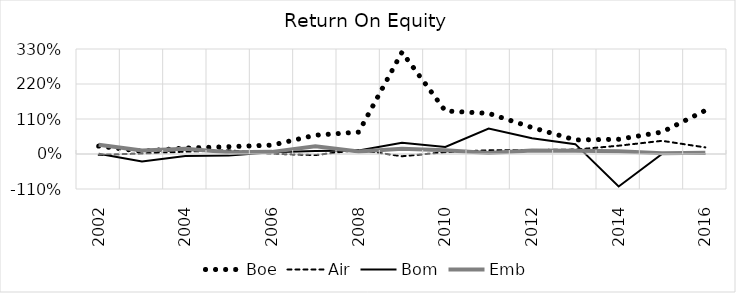
| Category | Boe | Air | Bom | Emb |
|---|---|---|---|---|
| 2002.0 | 0.248 | -0.026 | 0.01 | 0.294 |
| 2003.0 | 0.087 | 0.014 | -0.232 | 0.111 |
| 2004.0 | 0.187 | 0.074 | -0.066 | 0.165 |
| 2005.0 | 0.229 | 0.115 | -0.051 | 0.058 |
| 2006.0 | 0.279 | 0.008 | 0.057 | 0.067 |
| 2007.0 | 0.591 | -0.034 | 0.094 | 0.245 |
| 2008.0 | 0.688 | 0.13 | 0.108 | 0.081 |
| 2009.0 | 3.201 | -0.071 | 0.356 | 0.168 |
| 2010.0 | 1.353 | 0.057 | 0.224 | 0.116 |
| 2011.0 | 1.277 | 0.117 | 0.8 | 0.029 |
| 2012.0 | 0.832 | 0.124 | 0.497 | 0.113 |
| 2013.0 | 0.442 | 0.139 | 0.31 | 0.104 |
| 2014.0 | 0.463 | 0.261 | -1.021 | 0.087 |
| 2015.0 | 0.69 | 0.414 | 0 | 0.02 |
| 2016.0 | 1.369 | 0.207 | 0 | 0.043 |